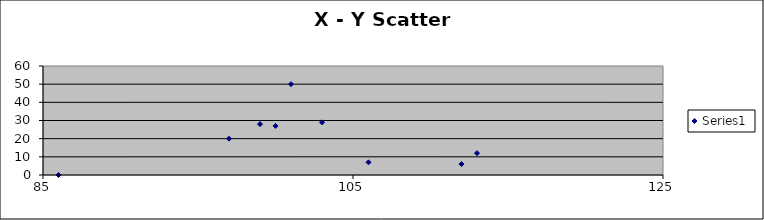
| Category | Series 0 |
|---|---|
| 106.0 | 7 |
| 86.0 | 0 |
| 100.0 | 27 |
| 101.0 | 50 |
| 99.0 | 28 |
| 103.0 | 29 |
| 97.0 | 20 |
| 113.0 | 12 |
| 112.0 | 6 |